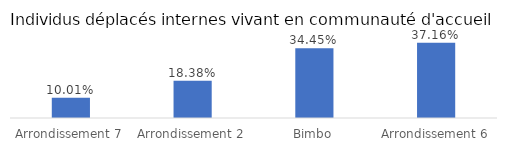
| Category | Individus |
|---|---|
| Arrondissement 7 | 0.1 |
| Arrondissement 2 | 0.184 |
| Bimbo | 0.345 |
| Arrondissement 6 | 0.372 |